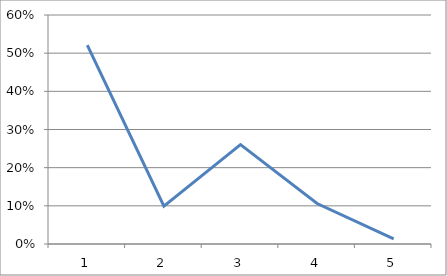
| Category | Series 0 |
|---|---|
| 0 | 0.521 |
| 1 | 0.099 |
| 2 | 0.26 |
| 3 | 0.106 |
| 4 | 0.013 |